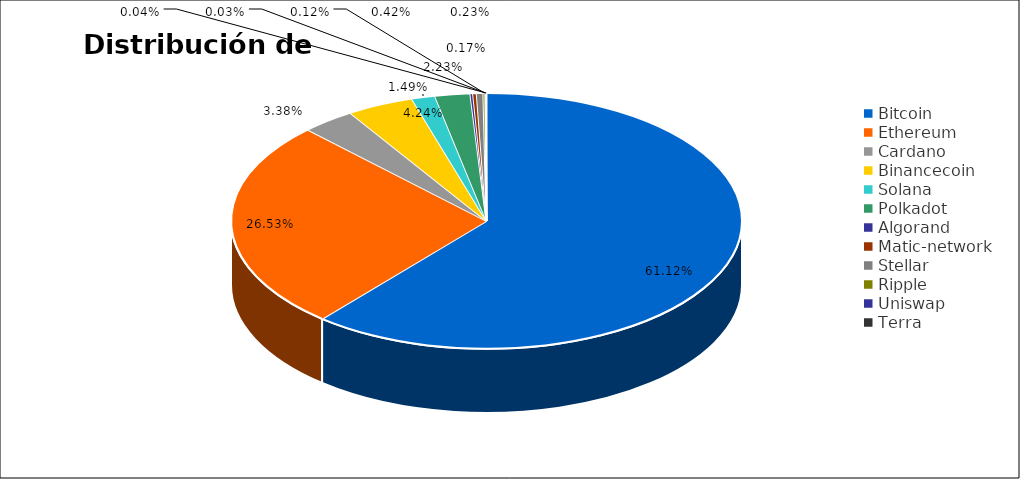
| Category | Distribución de Valor |
|---|---|
| Bitcoin | 0.611 |
| Ethereum | 0.265 |
| Cardano | 0.034 |
| Binancecoin | 0.042 |
| Solana | 0.015 |
| Polkadot | 0.022 |
| Algorand | 0.002 |
| Matic-network | 0.002 |
| Stellar | 0.004 |
| Ripple | 0.001 |
| Uniswap | 0 |
| Terra | 0 |